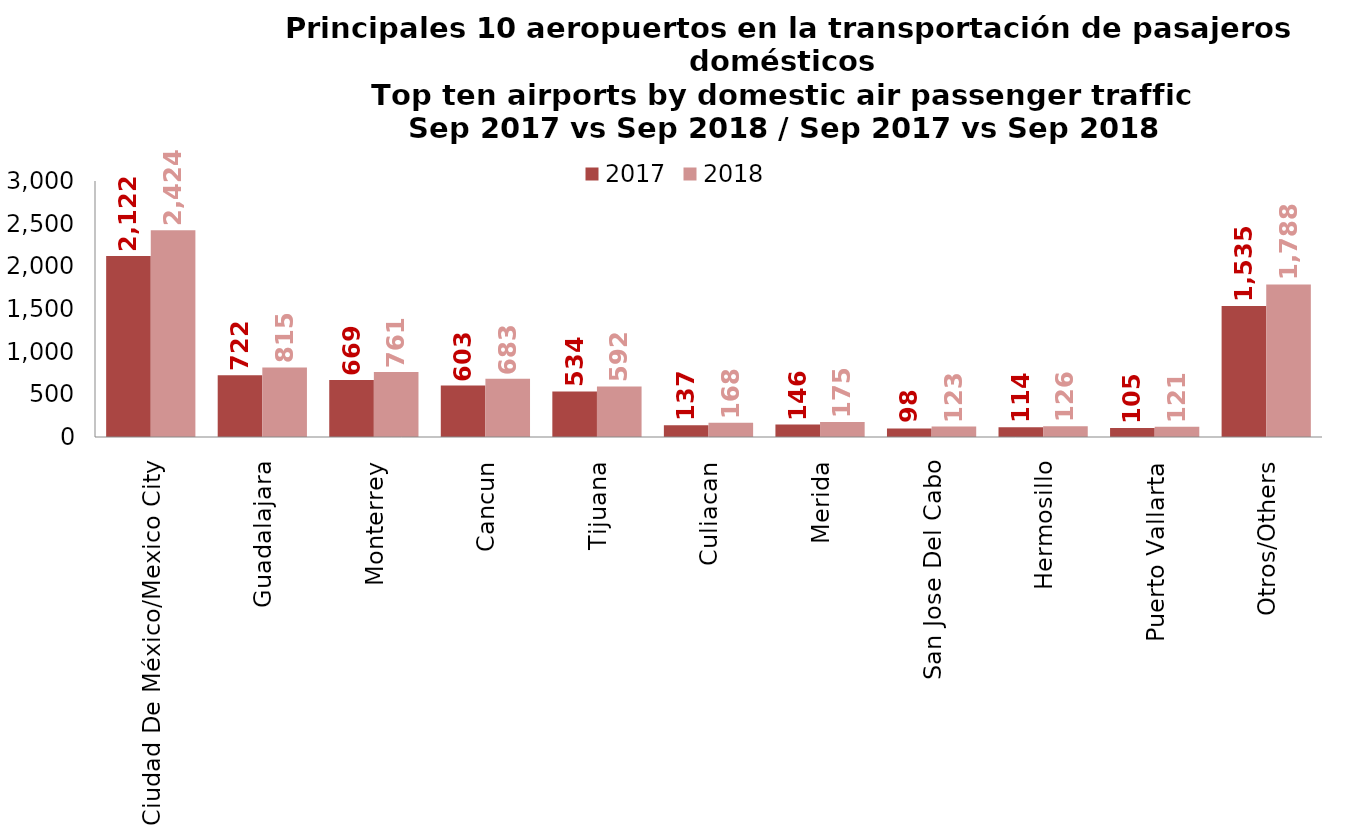
| Category | 2017 | 2018 |
|---|---|---|
| Ciudad De México/Mexico City | 2121.605 | 2423.521 |
| Guadalajara | 722.306 | 814.975 |
| Monterrey | 669.337 | 760.737 |
| Cancun | 603.359 | 683.428 |
| Tijuana | 533.791 | 591.914 |
| Culiacan | 137.199 | 167.807 |
| Merida | 146.22 | 175.195 |
| San Jose Del Cabo | 98.359 | 122.67 |
| Hermosillo | 113.987 | 125.925 |
| Puerto Vallarta | 104.709 | 121.441 |
| Otros/Others | 1534.576 | 1787.955 |